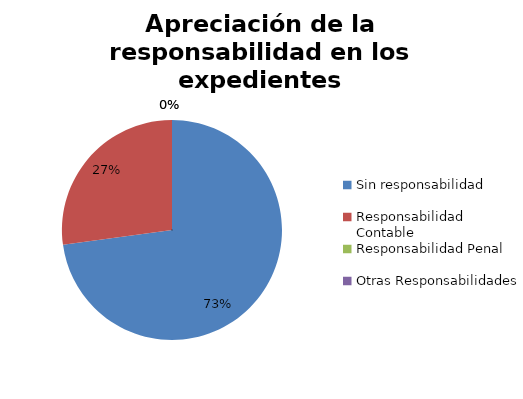
| Category | Series 0 |
|---|---|
| Sin responsabilidad | 169 |
| Responsabilidad Contable | 63 |
| Responsabilidad Penal | 0 |
| Otras Responsabilidades | 0 |